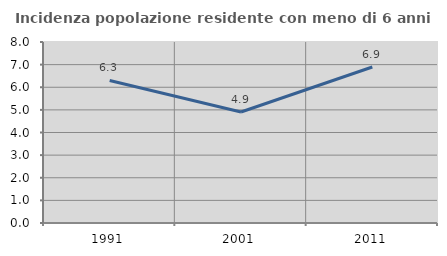
| Category | Incidenza popolazione residente con meno di 6 anni |
|---|---|
| 1991.0 | 6.299 |
| 2001.0 | 4.905 |
| 2011.0 | 6.897 |